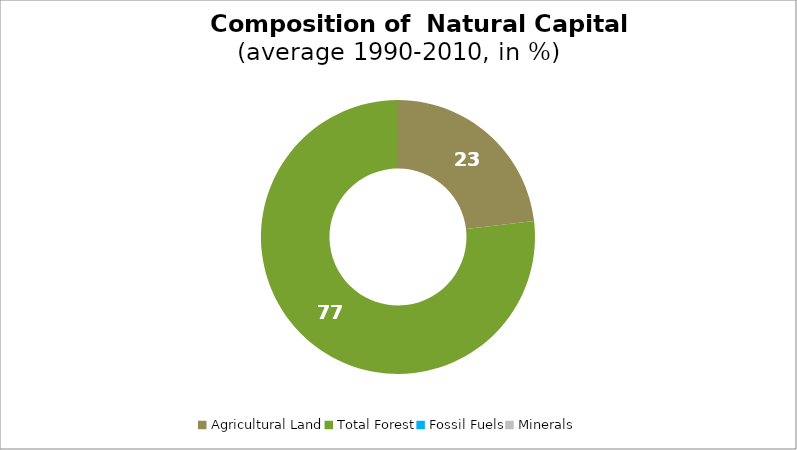
| Category | Series 0 |
|---|---|
| Agricultural Land | 23.132 |
| Total Forest | 76.868 |
| Fossil Fuels | 0 |
| Minerals | 0 |